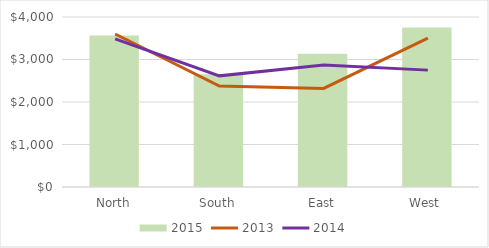
| Category | 2015 |
|---|---|
| North | 3565 |
| South | 2655 |
| East | 3135 |
| West | 3755 |